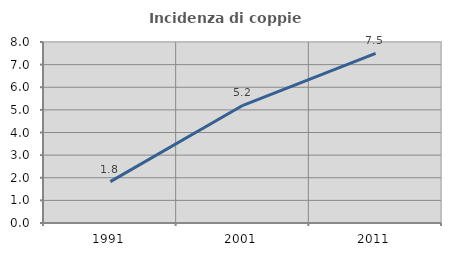
| Category | Incidenza di coppie miste |
|---|---|
| 1991.0 | 1.828 |
| 2001.0 | 5.202 |
| 2011.0 | 7.493 |